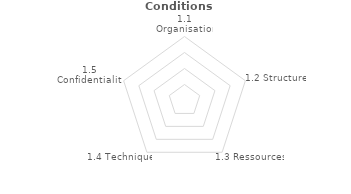
| Category | Series 2 |
|---|---|
| 1.1 Organisation | 0 |
| 1.2 Structure | 0 |
| 1.3 Ressources | 0 |
| 1.4 Technique | 0 |
| 1.5 Confidentialité | 0 |